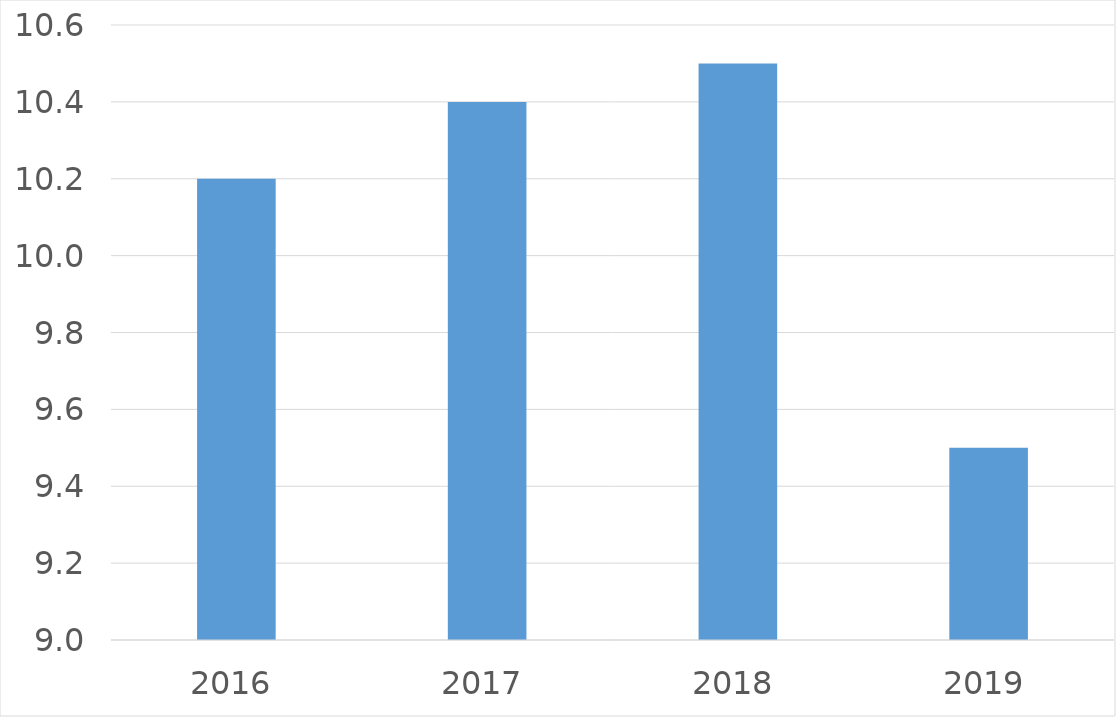
| Category | Series 0 |
|---|---|
| 2016 | 10.2 |
| 2017 | 10.4 |
| 2018 | 10.5 |
| 2019 | 9.5 |